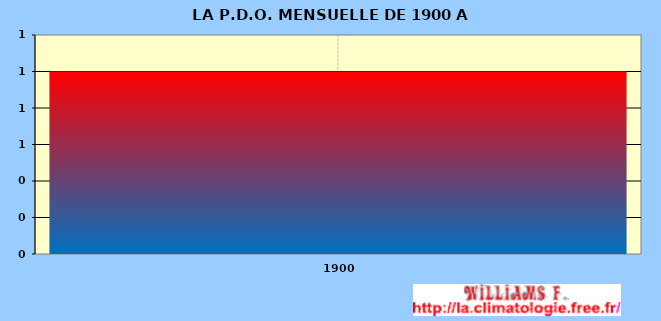
| Category | Series 0 |
|---|---|
| 1900-01-01 | 1 |